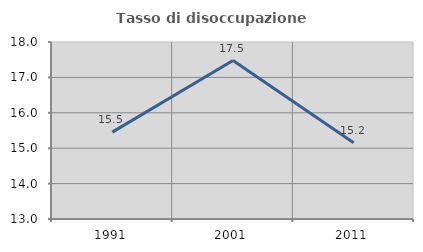
| Category | Tasso di disoccupazione giovanile  |
|---|---|
| 1991.0 | 15.455 |
| 2001.0 | 17.476 |
| 2011.0 | 15.152 |